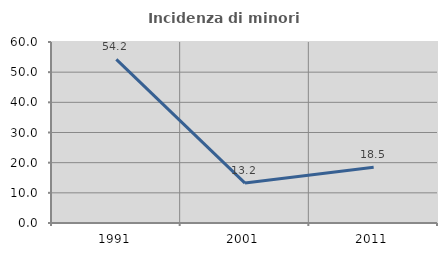
| Category | Incidenza di minori stranieri |
|---|---|
| 1991.0 | 54.217 |
| 2001.0 | 13.235 |
| 2011.0 | 18.513 |